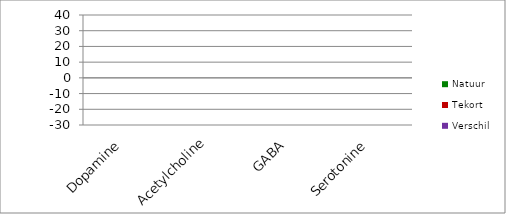
| Category |    | Natuur | Tekort | Verschil |
|---|---|---|---|---|
| Dopamine |  | 0 | 0 | 0 |
| Acetylcholine |  | 0 | 0 | 0 |
| GABA |  | 0 | 0 | 0 |
| Serotonine |  | 0 | 0 | 0 |